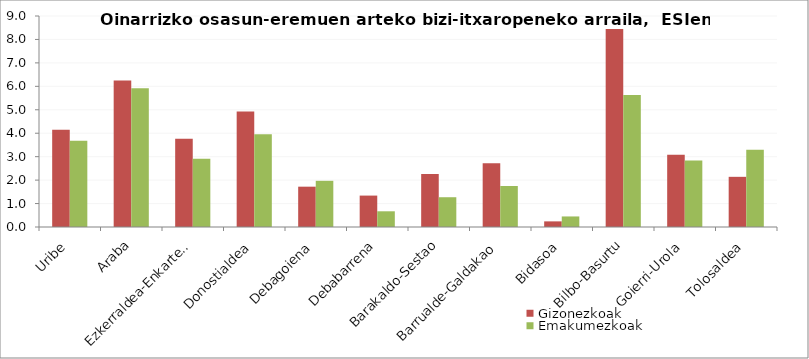
| Category | Gizonezkoak | Emakumezkoak |
|---|---|---|
| Uribe | 4.15 | 3.68 |
| Araba | 6.25 | 5.92 |
| Ezkerraldea-Enkarterri-Cruces | 3.76 | 2.91 |
| Donostialdea | 4.93 | 3.96 |
| Debagoiena | 1.72 | 1.97 |
| Debabarrena | 1.34 | 0.67 |
| Barakaldo-Sestao | 2.26 | 1.27 |
| Barrualde-Galdakao | 2.72 | 1.75 |
| Bidasoa | 0.24 | 0.45 |
| Bilbo-Basurtu | 8.45 | 5.63 |
| Goierri-Urola | 3.08 | 2.84 |
| Tolosaldea | 2.14 | 3.3 |